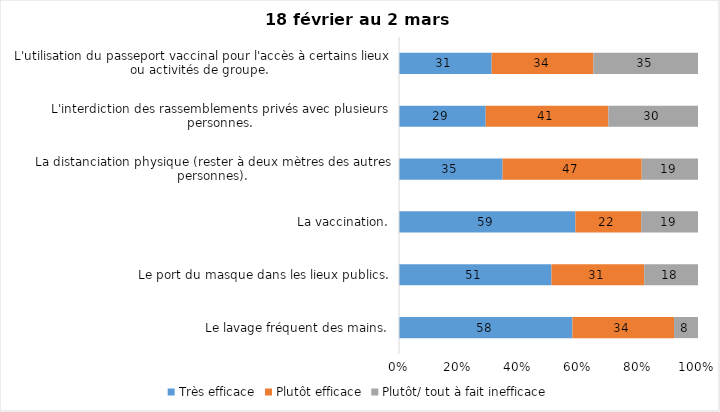
| Category | Très efficace | Plutôt efficace | Plutôt/ tout à fait inefficace |
|---|---|---|---|
| Le lavage fréquent des mains. | 58 | 34 | 8 |
| Le port du masque dans les lieux publics. | 51 | 31 | 18 |
| La vaccination. | 59 | 22 | 19 |
| La distanciation physique (rester à deux mètres des autres personnes). | 35 | 47 | 19 |
| L'interdiction des rassemblements privés avec plusieurs personnes. | 29 | 41 | 30 |
| L'utilisation du passeport vaccinal pour l'accès à certains lieux ou activités de groupe.  | 31 | 34 | 35 |